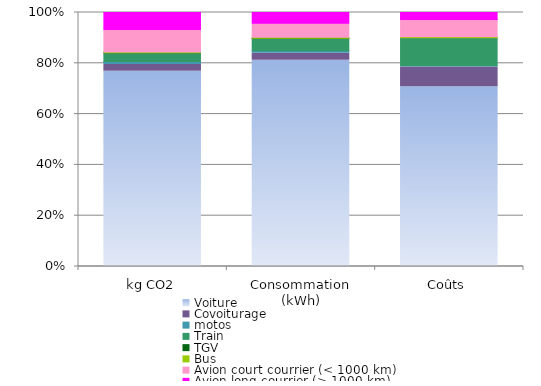
| Category | Voiture | Covoiturage | motos | Train | TGV | Bus | Avion court courrier (< 1000 km) | Avion long courrier (> 1000 km) | Vélo/pieds |
|---|---|---|---|---|---|---|---|---|---|
| kg CO2 | 72099.29 | 2504.7 | 1056.599 | 3212.933 | 7.264 | 326.7 | 8243.888 | 6315.49 | 0 |
| Consommation (kWh) | 208052.939 | 6994.751 | 2739.726 | 12357.434 | 41.909 | 1042.556 | 14180.889 | 10863.717 | 0 |
| Coûts | 31570 | 3465 | 250 | 4904.113 | 0 | 171.6 | 3000 | 1250 | 0 |